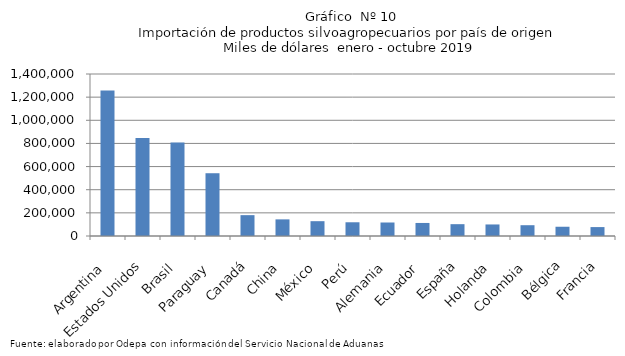
| Category | Series 0 |
|---|---|
| Argentina | 1257406.574 |
| Estados Unidos | 846603.84 |
| Brasil | 808690.249 |
| Paraguay | 542477.292 |
| Canadá | 180167.84 |
| China | 143689.808 |
| México | 128057.215 |
| Perú | 118674.547 |
| Alemania | 116653.139 |
| Ecuador | 112694.337 |
| España | 102195.453 |
| Holanda | 99761.812 |
| Colombia | 93293.529 |
| Bélgica | 80011.583 |
| Francia | 77043.299 |